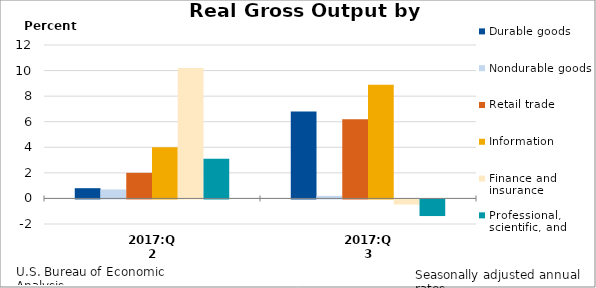
| Category | Durable goods | Nondurable goods | Retail trade | Information | Finance and insurance | Professional, scientific, and technical services |
|---|---|---|---|---|---|---|
| 2017:Q2 | 0.8 | 0.7 | 2 | 4 | 10.2 | 3.1 |
| 2017:Q3 | 6.8 | 0.2 | 6.2 | 8.9 | -0.4 | -1.3 |